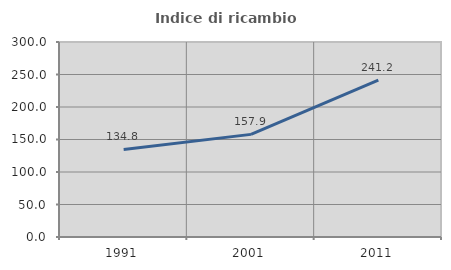
| Category | Indice di ricambio occupazionale  |
|---|---|
| 1991.0 | 134.783 |
| 2001.0 | 157.895 |
| 2011.0 | 241.176 |